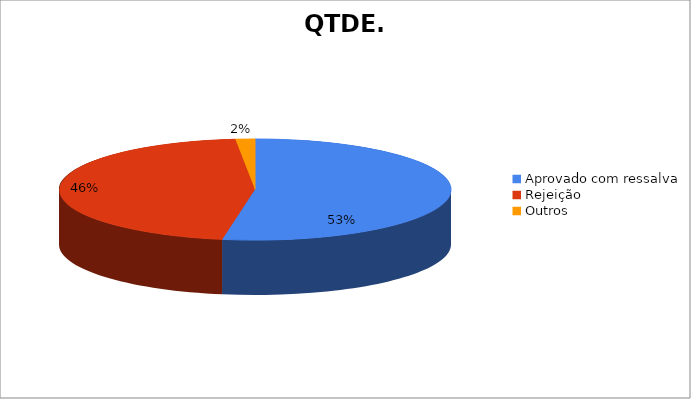
| Category | QTDE. |
|---|---|
| Aprovado com ressalva | 99 |
| Rejeição | 86 |
| Outros | 3 |